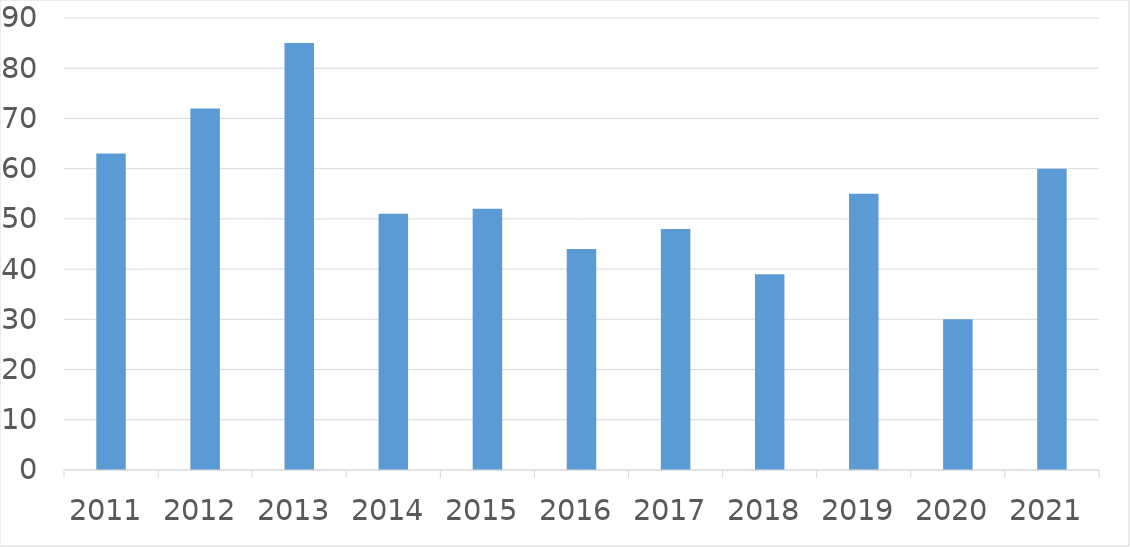
| Category | Series 0 |
|---|---|
| 2011 | 63 |
| 2012 | 72 |
| 2013 | 85 |
| 2014 | 51 |
| 2015 | 52 |
| 2016 | 44 |
| 2017 | 48 |
| 2018 | 39 |
| 2019 | 55 |
| 2020 | 30 |
| 2021 | 60 |